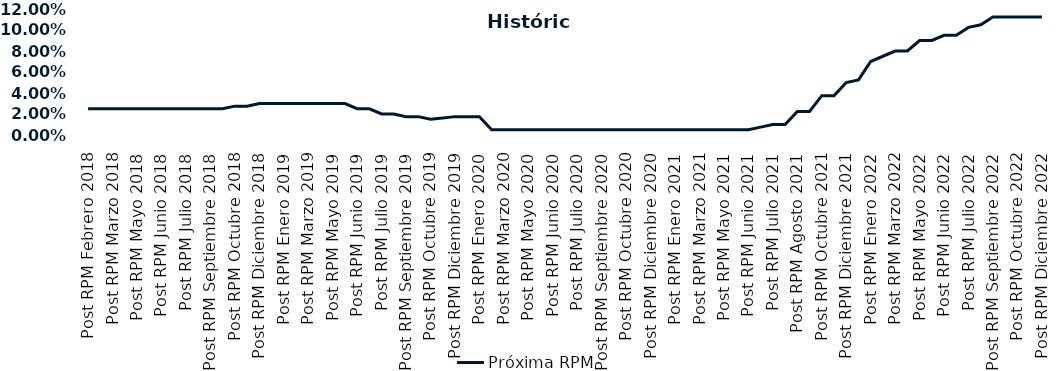
| Category | Próxima RPM |
|---|---|
| Post RPM Febrero 2018 | 0.025 |
| Pre RPM Marzo 2018 | 0.025 |
| Post RPM Marzo 2018 | 0.025 |
| Pre RPM Mayo 2018 | 0.025 |
| Post RPM Mayo 2018 | 0.025 |
| Pre RPM Junio 2018 | 0.025 |
| Post RPM Junio 2018 | 0.025 |
| Pre RPM Julio 2018 | 0.025 |
| Post RPM Julio 2018 | 0.025 |
| Pre RPM Septiembre 2018 | 0.025 |
| Post RPM Septiembre 2018 | 0.025 |
| Pre RPM Octubre 2018 | 0.025 |
| Post RPM Octubre 2018 | 0.028 |
| Pre RPM Diciembre 2018 | 0.028 |
| Post RPM Diciembre 2018 | 0.03 |
| Pre RPM Enero 2019 | 0.03 |
| Post RPM Enero 2019 | 0.03 |
| Pre RPM Marzo 2019 | 0.03 |
| Post RPM Marzo 2019 | 0.03 |
| Pre RPM Mayo 2019 | 0.03 |
| Post RPM Mayo 2019 | 0.03 |
| Pre RPM Junio 2019 | 0.03 |
| Post RPM Junio 2019 | 0.025 |
| Pre RPM Julio 2019 | 0.025 |
| Post RPM Julio 2019 | 0.02 |
| Pre RPM Septiembre 2019 | 0.02 |
| Post RPM Septiembre 2019 | 0.018 |
| Pre RPM Octubre 2019 | 0.018 |
| Post RPM Octubre 2019 | 0.015 |
| Pre RPM Diciembre 2019 | 0.016 |
| Post RPM Diciembre 2019 | 0.018 |
| Pre RPM Enero 2020 | 0.018 |
| Post RPM Enero 2020 | 0.018 |
| Pre RPM Marzo 2020 | 0.005 |
| Post RPM Marzo 2020 | 0.005 |
| Pre RPM Mayo 2020 | 0.005 |
| Post RPM Mayo 2020 | 0.005 |
| Pre RPM Junio 2020 | 0.005 |
| Post RPM Junio 2020 | 0.005 |
| Pre RPM Julio 2020 | 0.005 |
| Post RPM Julio 2020 | 0.005 |
| Pre RPM Septiembre 2020 | 0.005 |
| Post RPM Septiembre 2020 | 0.005 |
| Pre RPM Octubre 2020 | 0.005 |
| Post RPM Octubre 2020 | 0.005 |
| Pre RPM Diciembre 2020 | 0.005 |
| Post RPM Diciembre 2020 | 0.005 |
| Pre RPM Enero 2021 | 0.005 |
| Post RPM Enero 2021 | 0.005 |
| Pre RPM Marzo 2021 | 0.005 |
| Post RPM Marzo 2021 | 0.005 |
| Pre RPM Mayo 2021 | 0.005 |
| Post RPM Mayo 2021 | 0.005 |
| Pre RPM Junio 2021 | 0.005 |
| Post RPM Junio 2021 | 0.005 |
| Pre RPM Julio 2021 | 0.008 |
| Post RPM Julio 2021 | 0.01 |
| Pre RPM Agosto 2021 | 0.01 |
| Post RPM Agosto 2021 | 0.022 |
| Pre RPM Octubre 2021 | 0.022 |
| Post RPM Octubre 2021 | 0.038 |
| Pre RPM Diciembre 2021 | 0.038 |
| Post RPM Diciembre 2021 | 0.05 |
| Pre RPM Enero 2022 | 0.052 |
| Post RPM Enero 2022 | 0.07 |
| Pre RPM Marzo 2022 | 0.075 |
| Post RPM Marzo 2022 | 0.08 |
| Pre RPM Mayo 2022 | 0.08 |
| Post RPM Mayo 2022 | 0.09 |
| Pre RPM Junio 2022 | 0.09 |
| Post RPM Junio 2022 | 0.095 |
| Pre RPM Julio 2022 | 0.095 |
| Post RPM Julio 2022 | 0.102 |
| Pre RPM Septiembre 2022 | 0.105 |
| Post RPM Septiembre 2022 | 0.112 |
| Pre RPM Octubre 2022 | 0.112 |
| Post RPM Octubre 2022 | 0.112 |
| Pre RPM Diciembre 2022 | 0.112 |
| Post RPM Diciembre 2022 | 0.112 |